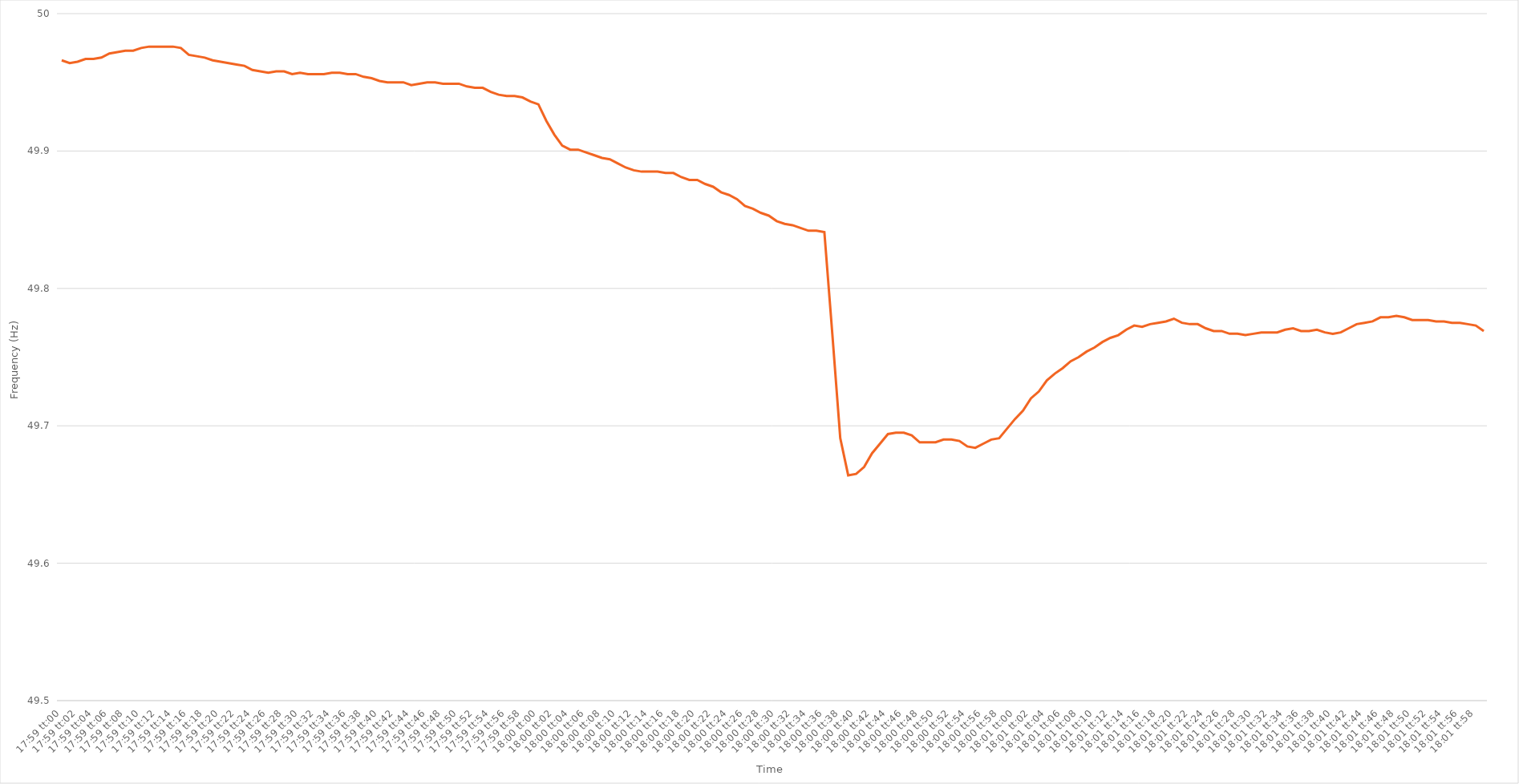
| Category | Series 0 |
|---|---|
| 0.7493055555555556 | 49.966 |
| 0.7493171296296296 | 49.964 |
| 0.7493287037037036 | 49.965 |
| 0.7493402777777778 | 49.967 |
| 0.7493518518518519 | 49.967 |
| 0.7493634259259259 | 49.968 |
| 0.749375 | 49.971 |
| 0.749386574074074 | 49.972 |
| 0.7493981481481482 | 49.973 |
| 0.7494097222222221 | 49.973 |
| 0.7494212962962963 | 49.975 |
| 0.7494328703703704 | 49.976 |
| 0.7494444444444445 | 49.976 |
| 0.7494560185185185 | 49.976 |
| 0.7494675925925925 | 49.976 |
| 0.7494791666666667 | 49.975 |
| 0.7494907407407408 | 49.97 |
| 0.7495023148148148 | 49.969 |
| 0.7495138888888889 | 49.968 |
| 0.749525462962963 | 49.966 |
| 0.749537037037037 | 49.965 |
| 0.749548611111111 | 49.964 |
| 0.7495601851851852 | 49.963 |
| 0.7495717592592593 | 49.962 |
| 0.7495833333333333 | 49.959 |
| 0.7495949074074074 | 49.958 |
| 0.7496064814814815 | 49.957 |
| 0.7496180555555556 | 49.958 |
| 0.7496296296296295 | 49.958 |
| 0.7496412037037037 | 49.956 |
| 0.7496527777777778 | 49.957 |
| 0.7496643518518519 | 49.956 |
| 0.7496759259259259 | 49.956 |
| 0.7496875 | 49.956 |
| 0.7496990740740741 | 49.957 |
| 0.7497106481481483 | 49.957 |
| 0.7497222222222222 | 49.956 |
| 0.7497337962962963 | 49.956 |
| 0.7497453703703704 | 49.954 |
| 0.7497569444444444 | 49.953 |
| 0.7497685185185184 | 49.951 |
| 0.7497800925925926 | 49.95 |
| 0.7497916666666667 | 49.95 |
| 0.7498032407407407 | 49.95 |
| 0.7498148148148148 | 49.948 |
| 0.7498263888888889 | 49.949 |
| 0.749837962962963 | 49.95 |
| 0.7498495370370369 | 49.95 |
| 0.7498611111111111 | 49.949 |
| 0.7498726851851852 | 49.949 |
| 0.7498842592592593 | 49.949 |
| 0.7498958333333333 | 49.947 |
| 0.7499074074074074 | 49.946 |
| 0.7499189814814815 | 49.946 |
| 0.7499305555555557 | 49.943 |
| 0.7499421296296296 | 49.941 |
| 0.7499537037037037 | 49.94 |
| 0.7499652777777778 | 49.94 |
| 0.7499768518518519 | 49.939 |
| 0.7499884259259259 | 49.936 |
| 0.75 | 49.934 |
| 0.7500115740740741 | 49.922 |
| 0.7500231481481481 | 49.912 |
| 0.7500347222222222 | 49.904 |
| 0.7500462962962963 | 49.901 |
| 0.7500578703703704 | 49.901 |
| 0.7500694444444443 | 49.899 |
| 0.7500810185185185 | 49.897 |
| 0.7500925925925926 | 49.895 |
| 0.7501041666666667 | 49.894 |
| 0.7501157407407407 | 49.891 |
| 0.7501273148148148 | 49.888 |
| 0.7501388888888889 | 49.886 |
| 0.7501504629629631 | 49.885 |
| 0.750162037037037 | 49.885 |
| 0.7501736111111111 | 49.885 |
| 0.7501851851851852 | 49.884 |
| 0.7501967592592593 | 49.884 |
| 0.7502083333333333 | 49.881 |
| 0.7502199074074074 | 49.879 |
| 0.7502314814814816 | 49.879 |
| 0.7502430555555555 | 49.876 |
| 0.7502546296296296 | 49.874 |
| 0.7502662037037037 | 49.87 |
| 0.7502777777777778 | 49.868 |
| 0.7502893518518517 | 49.865 |
| 0.7503009259259259 | 49.86 |
| 0.7503125 | 49.858 |
| 0.7503240740740741 | 49.855 |
| 0.7503356481481481 | 49.853 |
| 0.7503472222222222 | 49.849 |
| 0.7503587962962963 | 49.847 |
| 0.7503703703703705 | 49.846 |
| 0.7503819444444444 | 49.844 |
| 0.7503935185185185 | 49.842 |
| 0.7504050925925926 | 49.842 |
| 0.7504166666666667 | 49.841 |
| 0.7504282407407407 | 49.767 |
| 0.7504398148148148 | 49.691 |
| 0.750451388888889 | 49.664 |
| 0.750462962962963 | 49.665 |
| 0.750474537037037 | 49.67 |
| 0.7504861111111111 | 49.68 |
| 0.7504976851851852 | 49.687 |
| 0.7505092592592592 | 49.694 |
| 0.7505208333333333 | 49.695 |
| 0.7505324074074075 | 49.695 |
| 0.7505439814814815 | 49.693 |
| 0.7505555555555555 | 49.688 |
| 0.7505671296296296 | 49.688 |
| 0.7505787037037037 | 49.688 |
| 0.7505902777777779 | 49.69 |
| 0.7506018518518518 | 49.69 |
| 0.750613425925926 | 49.689 |
| 0.750625 | 49.685 |
| 0.7506365740740741 | 49.684 |
| 0.7506481481481481 | 49.687 |
| 0.7506597222222222 | 49.69 |
| 0.7506712962962964 | 49.691 |
| 0.7506828703703704 | 49.698 |
| 0.7506944444444444 | 49.705 |
| 0.7507060185185185 | 49.711 |
| 0.7507175925925926 | 49.72 |
| 0.7507291666666666 | 49.725 |
| 0.7507407407407407 | 49.733 |
| 0.7507523148148149 | 49.738 |
| 0.7507638888888889 | 49.742 |
| 0.7507754629629629 | 49.747 |
| 0.750787037037037 | 49.75 |
| 0.7507986111111111 | 49.754 |
| 0.7508101851851853 | 49.757 |
| 0.7508217592592592 | 49.761 |
| 0.7508333333333334 | 49.764 |
| 0.7508449074074074 | 49.766 |
| 0.7508564814814815 | 49.77 |
| 0.7508680555555555 | 49.773 |
| 0.7508796296296296 | 49.772 |
| 0.7508912037037038 | 49.774 |
| 0.7509027777777778 | 49.775 |
| 0.7509143518518518 | 49.776 |
| 0.7509259259259259 | 49.778 |
| 0.7509375 | 49.775 |
| 0.750949074074074 | 49.774 |
| 0.7509606481481481 | 49.774 |
| 0.7509722222222223 | 49.771 |
| 0.7509837962962963 | 49.769 |
| 0.7509953703703703 | 49.769 |
| 0.7510069444444444 | 49.767 |
| 0.7510185185185185 | 49.767 |
| 0.7510300925925927 | 49.766 |
| 0.7510416666666666 | 49.767 |
| 0.7510532407407408 | 49.768 |
| 0.7510648148148148 | 49.768 |
| 0.751076388888889 | 49.768 |
| 0.7510879629629629 | 49.77 |
| 0.751099537037037 | 49.771 |
| 0.7511111111111112 | 49.769 |
| 0.7511226851851852 | 49.769 |
| 0.7511342592592593 | 49.77 |
| 0.7511458333333333 | 49.768 |
| 0.7511574074074074 | 49.767 |
| 0.7511689814814816 | 49.768 |
| 0.7511805555555555 | 49.771 |
| 0.7511921296296297 | 49.774 |
| 0.7512037037037037 | 49.775 |
| 0.7512152777777777 | 49.776 |
| 0.7512268518518518 | 49.779 |
| 0.7512384259259259 | 49.779 |
| 0.7512500000000001 | 49.78 |
| 0.751261574074074 | 49.779 |
| 0.7512731481481482 | 49.777 |
| 0.7512847222222222 | 49.777 |
| 0.7512962962962964 | 49.777 |
| 0.7513078703703703 | 49.776 |
| 0.7513194444444444 | 49.776 |
| 0.7513310185185186 | 49.775 |
| 0.7513425925925926 | 49.775 |
| 0.7513541666666667 | 49.774 |
| 0.7513657407407407 | 49.773 |
| 0.7513773148148148 | 49.769 |